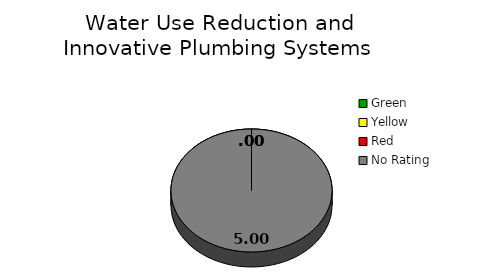
| Category | Counts |
|---|---|
| Green | 0 |
| Yellow | 0 |
| Red | 0 |
| No Rating | 5 |